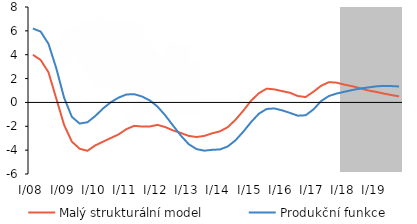
| Category | Malý strukturální model | Produkční funkce |
|---|---|---|
| I/08 | 3.997 | 6.2 |
| II | 3.554 | 5.936 |
| III | 2.528 | 4.91 |
| IV | 0.326 | 2.868 |
| I/09 | -1.875 | 0.403 |
| II | -3.286 | -1.209 |
| III | -3.883 | -1.771 |
| IV | -4.055 | -1.662 |
| I/10 | -3.604 | -1.145 |
| II | -3.29 | -0.507 |
| III | -2.984 | 0.013 |
| IV | -2.68 | 0.404 |
| I/11 | -2.238 | 0.666 |
| II | -1.964 | 0.692 |
| III | -2.017 | 0.5 |
| IV | -2.016 | 0.173 |
| I/12 | -1.881 | -0.355 |
| II | -2.07 | -1.095 |
| III | -2.352 | -1.951 |
| IV | -2.565 | -2.79 |
| I/13 | -2.805 | -3.501 |
| II | -2.901 | -3.912 |
| III | -2.806 | -4.044 |
| IV | -2.589 | -3.973 |
| I/14 | -2.424 | -3.943 |
| II | -2.077 | -3.697 |
| III | -1.455 | -3.177 |
| IV | -0.7 | -2.459 |
| I/15 | 0.143 | -1.647 |
| II | 0.773 | -0.947 |
| III | 1.155 | -0.548 |
| IV | 1.093 | -0.505 |
| I/16 | 0.947 | -0.665 |
| II | 0.809 | -0.882 |
| III | 0.536 | -1.11 |
| IV | 0.453 | -1.078 |
| I/17 | 0.893 | -0.592 |
| II | 1.401 | 0.119 |
| III | 1.702 | 0.541 |
| IV | 1.656 | 0.748 |
| I/18 | 1.487 | 0.896 |
| II | 1.357 | 1.042 |
| III | 1.19 | 1.161 |
| IV | 1.005 | 1.252 |
| I/19 | 0.891 | 1.343 |
| II | 0.747 | 1.388 |
| III | 0.621 | 1.371 |
| IV | 0.506 | 1.338 |